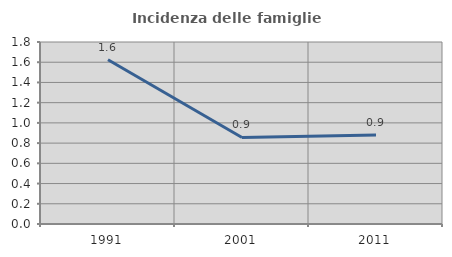
| Category | Incidenza delle famiglie numerose |
|---|---|
| 1991.0 | 1.624 |
| 2001.0 | 0.856 |
| 2011.0 | 0.881 |